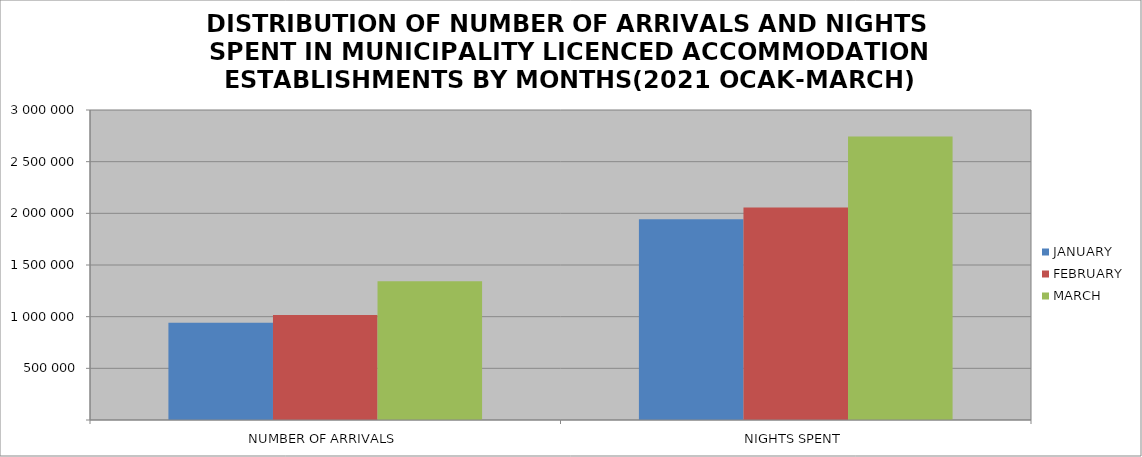
| Category | JANUARY | FEBRUARY | MARCH |
|---|---|---|---|
| NUMBER OF ARRIVALS | 940331 | 1017199 | 1342202 |
| NIGHTS SPENT | 1943007 | 2056594 | 2743257 |